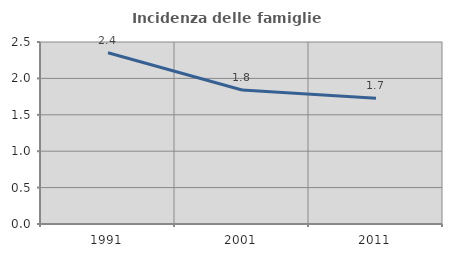
| Category | Incidenza delle famiglie numerose |
|---|---|
| 1991.0 | 2.352 |
| 2001.0 | 1.84 |
| 2011.0 | 1.727 |